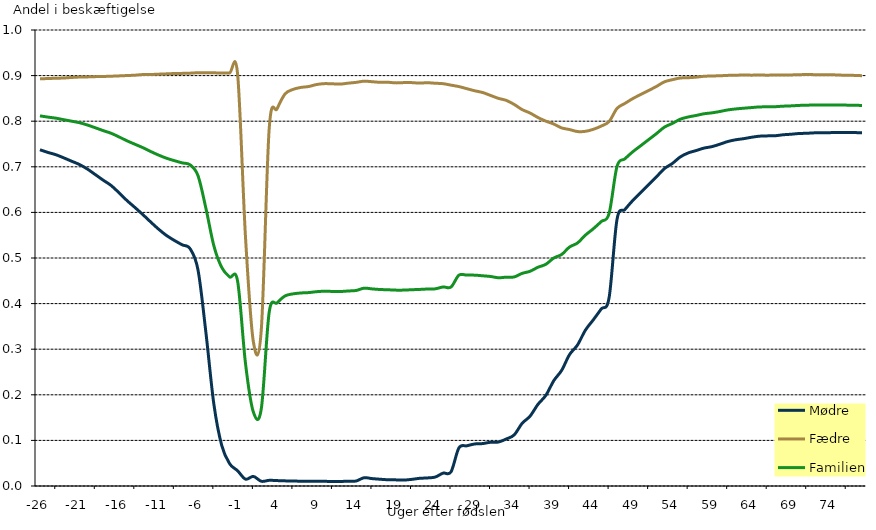
| Category | Mødre | Fædre | Familien |
|---|---|---|---|
| -26.0 | 0.737 | 0.893 | 0.812 |
| -25.0 | 0.732 | 0.894 | 0.809 |
| -24.0 | 0.727 | 0.894 | 0.807 |
| -23.0 | 0.72 | 0.895 | 0.803 |
| -22.0 | 0.712 | 0.896 | 0.8 |
| -21.0 | 0.705 | 0.897 | 0.797 |
| -20.0 | 0.695 | 0.897 | 0.792 |
| -19.0 | 0.683 | 0.898 | 0.786 |
| -18.0 | 0.671 | 0.898 | 0.779 |
| -17.0 | 0.659 | 0.899 | 0.774 |
| -16.0 | 0.643 | 0.899 | 0.766 |
| -15.0 | 0.626 | 0.9 | 0.757 |
| -14.0 | 0.611 | 0.901 | 0.75 |
| -13.0 | 0.595 | 0.902 | 0.742 |
| -12.0 | 0.579 | 0.902 | 0.734 |
| -11.0 | 0.563 | 0.903 | 0.726 |
| -10.0 | 0.549 | 0.904 | 0.719 |
| -9.0 | 0.539 | 0.905 | 0.714 |
| -8.0 | 0.529 | 0.905 | 0.709 |
| -7.0 | 0.52 | 0.905 | 0.704 |
| -6.0 | 0.473 | 0.906 | 0.68 |
| -5.0 | 0.336 | 0.906 | 0.609 |
| -4.0 | 0.18 | 0.906 | 0.527 |
| -3.0 | 0.089 | 0.906 | 0.479 |
| -2.0 | 0.049 | 0.906 | 0.458 |
| -1.0 | 0.034 | 0.904 | 0.45 |
| 0.0 | 0.015 | 0.547 | 0.269 |
| 1.0 | 0.021 | 0.316 | 0.162 |
| 2.0 | 0.01 | 0.343 | 0.169 |
| 3.0 | 0.012 | 0.784 | 0.381 |
| 4.0 | 0.012 | 0.827 | 0.402 |
| 5.0 | 0.011 | 0.86 | 0.417 |
| 6.0 | 0.011 | 0.87 | 0.421 |
| 7.0 | 0.011 | 0.874 | 0.423 |
| 8.0 | 0.01 | 0.876 | 0.424 |
| 9.0 | 0.01 | 0.88 | 0.426 |
| 10.0 | 0.01 | 0.882 | 0.427 |
| 11.0 | 0.01 | 0.882 | 0.427 |
| 12.0 | 0.01 | 0.881 | 0.426 |
| 13.0 | 0.01 | 0.883 | 0.428 |
| 14.0 | 0.011 | 0.885 | 0.429 |
| 15.0 | 0.018 | 0.888 | 0.434 |
| 16.0 | 0.016 | 0.887 | 0.432 |
| 17.0 | 0.015 | 0.885 | 0.431 |
| 18.0 | 0.014 | 0.885 | 0.43 |
| 19.0 | 0.013 | 0.884 | 0.43 |
| 20.0 | 0.013 | 0.885 | 0.43 |
| 21.0 | 0.014 | 0.885 | 0.43 |
| 22.0 | 0.017 | 0.884 | 0.431 |
| 23.0 | 0.018 | 0.884 | 0.432 |
| 24.0 | 0.02 | 0.883 | 0.432 |
| 25.0 | 0.028 | 0.882 | 0.436 |
| 26.0 | 0.031 | 0.879 | 0.436 |
| 27.0 | 0.084 | 0.876 | 0.462 |
| 28.0 | 0.088 | 0.871 | 0.462 |
| 29.0 | 0.092 | 0.867 | 0.462 |
| 30.0 | 0.093 | 0.863 | 0.461 |
| 31.0 | 0.096 | 0.857 | 0.459 |
| 32.0 | 0.096 | 0.85 | 0.457 |
| 33.0 | 0.103 | 0.846 | 0.458 |
| 34.0 | 0.112 | 0.837 | 0.458 |
| 35.0 | 0.137 | 0.825 | 0.466 |
| 36.0 | 0.153 | 0.818 | 0.471 |
| 37.0 | 0.179 | 0.808 | 0.48 |
| 38.0 | 0.199 | 0.8 | 0.486 |
| 39.0 | 0.231 | 0.794 | 0.5 |
| 40.0 | 0.254 | 0.785 | 0.508 |
| 41.0 | 0.288 | 0.782 | 0.524 |
| 42.0 | 0.309 | 0.777 | 0.533 |
| 43.0 | 0.342 | 0.778 | 0.55 |
| 44.0 | 0.364 | 0.782 | 0.564 |
| 45.0 | 0.388 | 0.789 | 0.58 |
| 46.0 | 0.413 | 0.799 | 0.598 |
| 47.0 | 0.584 | 0.828 | 0.701 |
| 48.0 | 0.606 | 0.839 | 0.717 |
| 49.0 | 0.626 | 0.85 | 0.733 |
| 50.0 | 0.643 | 0.859 | 0.746 |
| 51.0 | 0.661 | 0.867 | 0.76 |
| 52.0 | 0.678 | 0.876 | 0.773 |
| 53.0 | 0.696 | 0.886 | 0.787 |
| 54.0 | 0.707 | 0.891 | 0.795 |
| 55.0 | 0.722 | 0.895 | 0.804 |
| 56.0 | 0.73 | 0.895 | 0.809 |
| 57.0 | 0.736 | 0.897 | 0.813 |
| 58.0 | 0.741 | 0.898 | 0.816 |
| 59.0 | 0.744 | 0.899 | 0.818 |
| 60.0 | 0.749 | 0.9 | 0.821 |
| 61.0 | 0.755 | 0.9 | 0.825 |
| 62.0 | 0.759 | 0.901 | 0.827 |
| 63.0 | 0.762 | 0.901 | 0.828 |
| 64.0 | 0.765 | 0.901 | 0.83 |
| 65.0 | 0.767 | 0.901 | 0.831 |
| 66.0 | 0.768 | 0.901 | 0.831 |
| 67.0 | 0.768 | 0.901 | 0.832 |
| 68.0 | 0.77 | 0.901 | 0.833 |
| 69.0 | 0.771 | 0.902 | 0.834 |
| 70.0 | 0.773 | 0.902 | 0.835 |
| 71.0 | 0.774 | 0.903 | 0.835 |
| 72.0 | 0.774 | 0.902 | 0.835 |
| 73.0 | 0.775 | 0.902 | 0.835 |
| 74.0 | 0.775 | 0.902 | 0.836 |
| 75.0 | 0.775 | 0.901 | 0.835 |
| 76.0 | 0.775 | 0.901 | 0.835 |
| 77.0 | 0.775 | 0.9 | 0.835 |
| 78.0 | 0.775 | 0.9 | 0.835 |